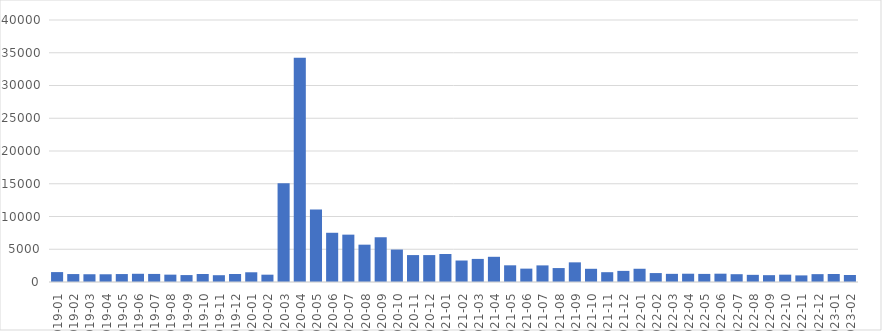
| Category | Series 0 |
|---|---|
| 2019-01 | 1512.5 |
| 2019-02 | 1212 |
| 2019-03 | 1185.4 |
| 2019-04 | 1179.5 |
| 2019-05 | 1213.25 |
| 2019-06 | 1255.4 |
| 2019-07 | 1231.25 |
| 2019-08 | 1123.4 |
| 2019-09 | 1058.5 |
| 2019-10 | 1220.75 |
| 2019-11 | 1037.8 |
| 2019-12 | 1221 |
| 2020-01 | 1484.75 |
| 2020-02 | 1116.8 |
| 2020-03 | 15084.5 |
| 2020-04 | 34232.75 |
| 2020-05 | 11079.2 |
| 2020-06 | 7515.25 |
| 2020-07 | 7229.5 |
| 2020-08 | 5699.4 |
| 2020-09 | 6831 |
| 2020-10 | 4952.4 |
| 2020-11 | 4111.25 |
| 2020-12 | 4109.25 |
| 2021-01 | 4276.2 |
| 2021-02 | 3280 |
| 2021-03 | 3525 |
| 2021-04 | 3847.5 |
| 2021-05 | 2548.6 |
| 2021-06 | 2041.25 |
| 2021-07 | 2536.2 |
| 2021-08 | 2128.25 |
| 2021-09 | 3001 |
| 2021-10 | 2017.6 |
| 2021-11 | 1497.5 |
| 2021-12 | 1696.25 |
| 2022-01 | 2021.8 |
| 2022-02 | 1363.75 |
| 2022-03 | 1245 |
| 2022-04 | 1265 |
| 2022-05 | 1234.75 |
| 2022-06 | 1269 |
| 2022-07 | 1191.2 |
| 2022-08 | 1093 |
| 2022-09 | 1042.5 |
| 2022-10 | 1118.8 |
| 2022-11 | 1008.5 |
| 2022-12 | 1200.4 |
| 2023-01 | 1218.5 |
| 2023-02 | 1072.333 |